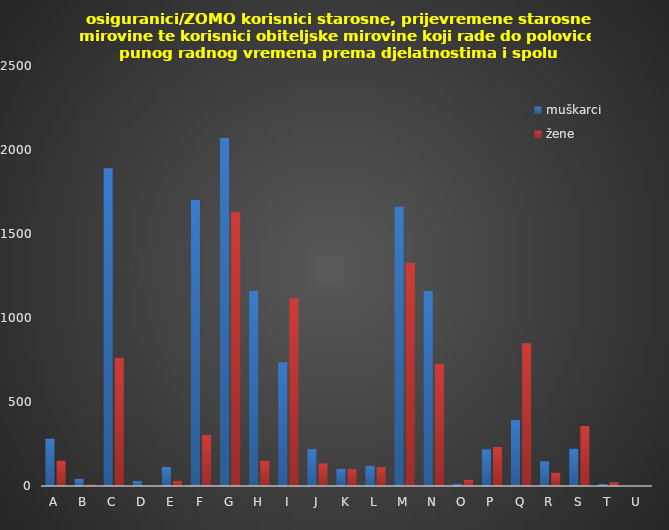
| Category | muškarci | žene |
|---|---|---|
| A | 282 | 151 |
| B | 43 | 8 |
| C | 1891 | 763 |
| D | 30 | 2 |
| E | 113 | 29 |
| F | 1703 | 303 |
| G | 2072 | 1630 |
| H | 1161 | 151 |
| I | 737 | 1117 |
| J | 219 | 134 |
| K | 101 | 100 |
| L | 121 | 113 |
| M | 1663 | 1328 |
| N | 1162 | 727 |
| O | 13 | 36 |
| P | 218 | 232 |
| Q | 393 | 850 |
| R | 147 | 79 |
| S | 222 | 358 |
| T | 11 | 22 |
| U | 0 | 0 |